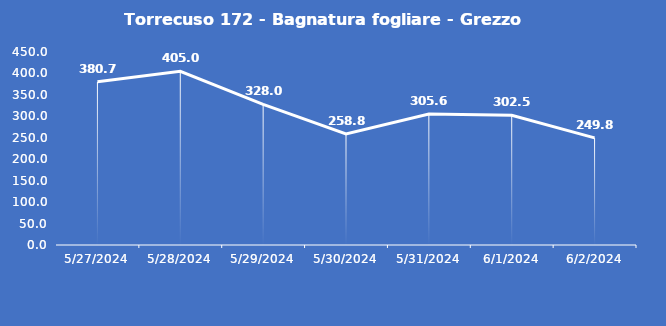
| Category | Torrecuso 172 - Bagnatura fogliare - Grezzo (min) |
|---|---|
| 5/27/24 | 380.7 |
| 5/28/24 | 405 |
| 5/29/24 | 328 |
| 5/30/24 | 258.8 |
| 5/31/24 | 305.6 |
| 6/1/24 | 302.5 |
| 6/2/24 | 249.8 |